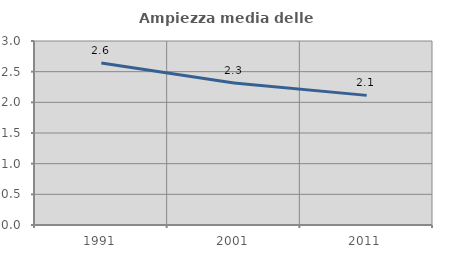
| Category | Ampiezza media delle famiglie |
|---|---|
| 1991.0 | 2.641 |
| 2001.0 | 2.314 |
| 2011.0 | 2.114 |